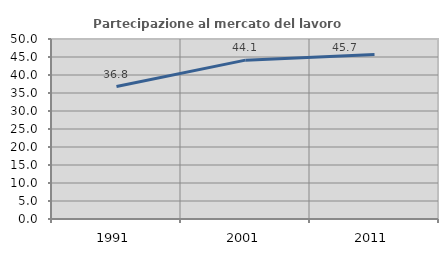
| Category | Partecipazione al mercato del lavoro  femminile |
|---|---|
| 1991.0 | 36.78 |
| 2001.0 | 44.128 |
| 2011.0 | 45.668 |